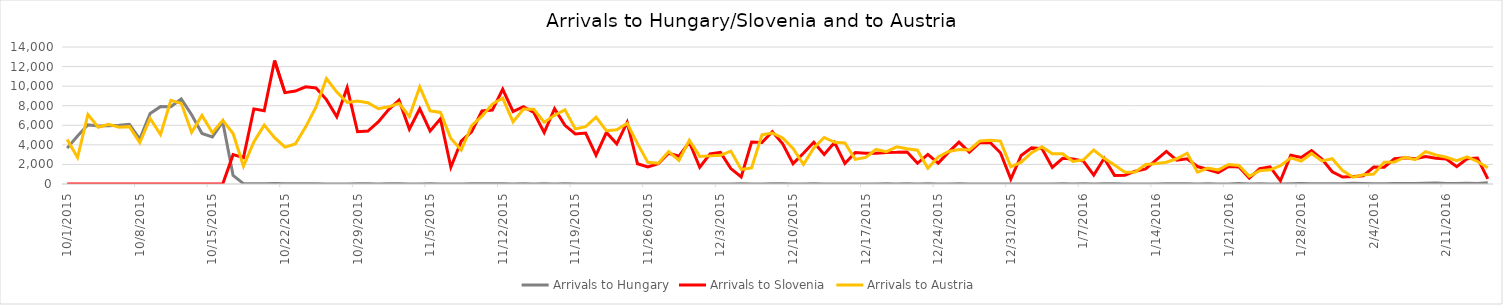
| Category | Arrivals to Hungary | Arrivals to Slovenia | Arrivals to Austria |
|---|---|---|---|
| 10/1/15 | 3667 | 0 | 4550 |
| 10/2/15 | 4897 | 0 | 2700 |
| 10/3/15 | 6056 | 0 | 7100 |
| 10/4/15 | 5925 | 0 | 5800 |
| 10/5/15 | 5952 | 0 | 6100 |
| 10/6/15 | 6000 | 0 | 5800 |
| 10/7/15 | 6103 | 0 | 5861 |
| 10/8/15 | 4583 | 6 | 4229 |
| 10/9/15 | 7215 | 0 | 6700 |
| 10/10/15 | 7907 | 0 | 5050 |
| 10/11/15 | 7897 | 0 | 8540 |
| 10/12/15 | 8702 | 0 | 8240 |
| 10/13/15 | 7081 | 0 | 5280 |
| 10/14/15 | 5157 | 0 | 7000 |
| 10/15/15 | 4808 | 0 | 5235 |
| 10/16/15 | 6353 | 0 | 6500 |
| 10/17/15 | 870 | 3000 | 5155 |
| 10/18/15 | 41 | 2700 | 1822 |
| 10/19/15 | 22 | 7677 | 4300 |
| 10/20/15 | 36 | 7478 | 6017 |
| 10/21/15 | 39 | 12616 | 4737 |
| 10/22/15 | 32 | 9339 | 3767 |
| 10/23/15 | 29 | 9500 | 4092 |
| 10/24/15 | 35 | 9925 | 5841 |
| 10/25/15 | 34 | 9818 | 7882 |
| 10/26/15 | 12 | 8625 | 10784 |
| 10/27/15 | 7 | 6877 | 9390 |
| 10/28/15 | 4 | 9848 | 8336 |
| 10/29/15 | 23 | 5341 | 8473 |
| 10/30/15 | 18 | 5409 | 8302 |
| 10/31/15 | 10 | 6344 | 7691 |
| 11/1/15 | 14 | 7611 | 7887 |
| 11/2/15 | 31 | 8568 | 8243 |
| 11/3/15 | 8 | 5591 | 6900 |
| 11/4/15 | 10 | 7693 | 9930 |
| 11/5/15 | 18 | 5426 | 7478 |
| 11/6/15 | 4 | 6655 | 7315 |
| 11/7/15 | 8 | 1716 | 4648 |
| 11/8/15 | 9 | 4381 | 3465 |
| 11/9/15 | 25 | 5341 | 5962 |
| 11/10/15 | 14 | 7457 | 6933 |
| 11/11/15 | 13 | 7554 | 8169 |
| 11/12/15 | 23 | 9681 | 8777 |
| 11/13/15 | 6 | 7397 | 6351 |
| 11/14/15 | 21 | 7905 | 7659 |
| 11/15/15 | 8 | 7300 | 7632 |
| 11/16/15 | 15 | 5261 | 6319 |
| 11/17/15 | 5 | 7704 | 7026 |
| 11/18/15 | 15 | 5998 | 7577 |
| 11/19/15 | 4 | 5119 | 5635 |
| 11/20/15 | 9 | 5211 | 5865 |
| 11/21/15 | 2 | 2952 | 6836 |
| 11/22/15 | 11 | 5260 | 5446 |
| 11/23/15 | 4 | 4102 | 5546 |
| 11/24/15 | 4 | 6297 | 6204 |
| 11/25/15 | 6 | 2070 | 4122 |
| 11/26/15 | 10 | 1742 | 2211 |
| 11/27/15 | 2 | 2065 | 2120 |
| 11/28/15 | 6 | 3139 | 3320 |
| 11/29/15 | 3 | 2843 | 2407 |
| 11/30/15 | 7 | 4274 | 4482 |
| 12/1/15 | 4 | 1709 | 2821 |
| 12/2/15 | 4 | 3077 | 2874 |
| 12/3/15 | 9 | 3237 | 2935 |
| 12/4/15 | 1 | 1577 | 3366 |
| 12/5/15 | 31 | 715 | 1493 |
| 12/6/15 | 7 | 4288 | 1643 |
| 12/7/15 | 0 | 4240 | 5035 |
| 12/8/15 | 13 | 5351 | 5210 |
| 12/9/15 | 14 | 4103 | 4714 |
| 12/10/15 | 3 | 2078 | 3623 |
| 12/11/15 | 0 | 3149 | 2000 |
| 12/12/15 | 13 | 4271 | 3675 |
| 12/13/15 | 10 | 3016 | 4754 |
| 12/14/15 | 3 | 4250 | 4263 |
| 12/15/15 | 2 | 2098 | 4193 |
| 12/16/15 | 6 | 3214 | 2519 |
| 12/17/15 | 0 | 3135 | 2717 |
| 12/18/15 | 11 | 3150 | 3532 |
| 12/19/15 | 31 | 3222 | 3305 |
| 12/20/15 | 8 | 3233 | 3800 |
| 12/21/15 | 25 | 3278 | 3611 |
| 12/22/15 | 1 | 2118 | 3451 |
| 12/23/15 | 21 | 3030 | 1613 |
| 12/24/15 | 8 | 2131 | 2764 |
| 12/25/15 | 2 | 3257 | 3321 |
| 12/26/15 | 17 | 4274 | 3532 |
| 12/27/15 | 10 | 3253 | 3476 |
| 12/28/15 | 0 | 4228 | 4394 |
| 12/29/15 | 0 | 4239 | 4468 |
| 12/30/15 | 11 | 3195 | 4386 |
| 12/31/15 | 5 | 511 | 1756 |
| 1/1/16 | 0 | 2914 | 2226 |
| 1/2/16 | 0 | 3690 | 3199 |
| 1/3/16 | 0 | 3619 | 3793 |
| 1/4/16 | 0 | 1708 | 3085 |
| 1/5/16 | 18 | 2626 | 3091 |
| 1/6/16 | 5 | 2550 | 2299 |
| 1/7/16 | 31 | 2337 | 2466 |
| 1/8/16 | 0 | 916 | 3472 |
| 1/9/16 | 15 | 2630 | 2619 |
| 1/10/16 | 28 | 880 | 1934 |
| 1/11/16 | 7 | 897 | 1204 |
| 1/12/16 | 2 | 1308 | 1231 |
| 1/13/16 | 0 | 1544 | 1991 |
| 1/14/16 | 4 | 2449 | 2082 |
| 1/15/16 | 30 | 3330 | 2219 |
| 1/16/16 | 30 | 2435 | 2578 |
| 1/17/16 | 30 | 2570 | 3141 |
| 1/18/16 | 9 | 1783 | 1203 |
| 1/19/16 | 29 | 1476 | 1630 |
| 1/20/16 | 0 | 1154 | 1439 |
| 1/21/16 | 10 | 1787 | 1989 |
| 1/22/16 | 47 | 1738 | 1885 |
| 1/23/16 | 10 | 606 | 777 |
| 1/24/16 | 15 | 1564 | 1366 |
| 1/25/16 | 5 | 1746 | 1450 |
| 1/26/16 | 4 | 326 | 1867 |
| 1/27/16 | 36 | 2935 | 2670 |
| 1/28/16 | 51 | 2719 | 2340 |
| 1/29/16 | 38 | 3416 | 3121 |
| 1/30/16 | 38 | 2556 | 2351 |
| 1/31/16 | 38 | 1249 | 2579 |
| 2/1/16 | 31 | 716 | 1367 |
| 2/2/16 | 69 | 765 | 690 |
| 2/3/16 | 46 | 841 | 937 |
| 2/4/16 | 31 | 1733 | 1026 |
| 2/5/16 | 19 | 1713 | 2235 |
| 2/6/16 | 49 | 2580 | 2252 |
| 2/7/16 | 53 | 2694 | 2737 |
| 2/8/16 | 48 | 2582 | 2490 |
| 2/9/16 | 72 | 2805 | 3314 |
| 2/10/16 | 104 | 2637 | 2968 |
| 2/11/16 | 54 | 2547 | 2731 |
| 2/12/16 | 39 | 1774 | 2378 |
| 2/13/16 | 66 | 2576 | 2781 |
| 2/14/16 | 51 | 2660 | 2301 |
| 2/15/16 | 119 | 516 | 1651 |